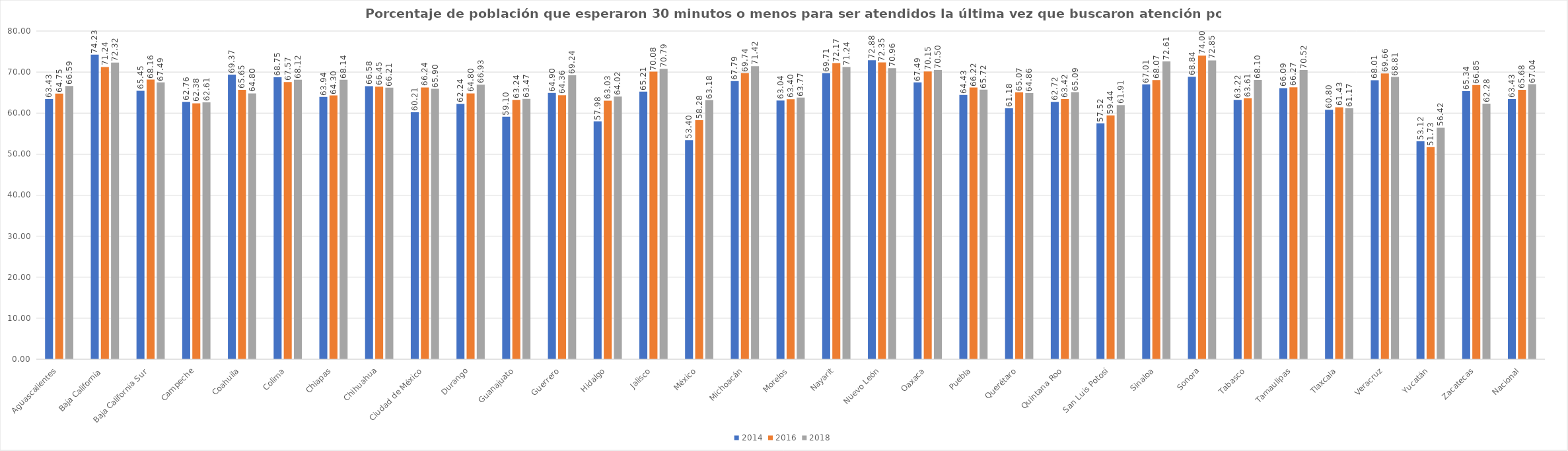
| Category | 2014 | 2016 | 2018 |
|---|---|---|---|
| Aguascalientes | 63.434 | 64.749 | 66.591 |
| Baja California | 74.226 | 71.238 | 72.317 |
| Baja California Sur | 65.448 | 68.163 | 67.492 |
| Campeche | 62.756 | 62.375 | 62.614 |
| Coahuila | 69.374 | 65.654 | 64.803 |
| Colima | 68.748 | 67.567 | 68.124 |
| Chiapas | 63.94 | 64.303 | 68.141 |
| Chihuahua | 66.579 | 66.449 | 66.213 |
| Ciudad de México | 60.214 | 66.239 | 65.901 |
| Durango | 62.238 | 64.8 | 66.93 |
| Guanajuato | 59.102 | 63.236 | 63.466 |
| Guerrero | 64.898 | 64.36 | 69.235 |
| Hidalgo | 57.98 | 63.027 | 64.018 |
| Jalisco | 65.214 | 70.083 | 70.79 |
| México | 53.402 | 58.276 | 63.178 |
| Michoacán | 67.788 | 69.739 | 71.42 |
| Morelos | 63.039 | 63.399 | 63.767 |
| Nayarit | 69.708 | 72.173 | 71.239 |
| Nuevo León | 72.876 | 72.346 | 70.956 |
| Oaxaca | 67.487 | 70.15 | 70.5 |
| Puebla | 64.428 | 66.22 | 65.72 |
| Querétaro | 61.176 | 65.069 | 64.86 |
| Quintana Roo | 62.719 | 63.421 | 65.093 |
| San Luis Potosí | 57.517 | 59.436 | 61.913 |
| Sinaloa | 67.008 | 68.067 | 72.608 |
| Sonora | 68.841 | 74.005 | 72.855 |
| Tabasco | 63.22 | 63.611 | 68.105 |
| Tamaulipas | 66.088 | 66.269 | 70.515 |
| Tlaxcala | 60.8 | 61.426 | 61.173 |
| Veracruz | 68.01 | 69.66 | 68.81 |
| Yucatán | 53.122 | 51.729 | 56.42 |
| Zacatecas | 65.339 | 66.85 | 62.277 |
| Nacional | 63.428 | 65.678 | 67.04 |